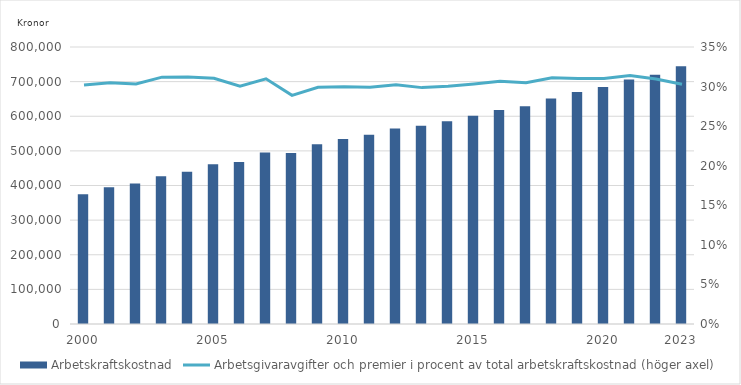
| Category | Arbetskraftskostnad |
|---|---|
| 2000.0 | 374821.811 |
| nan | 394929.41 |
| nan | 405636.358 |
| nan | 427073.221 |
| nan | 439980.788 |
| 2005.0 | 461141.969 |
| nan | 467924.926 |
| nan | 495044.887 |
| nan | 493653.782 |
| nan | 519279.334 |
| 2010.0 | 534587.595 |
| nan | 546799.999 |
| nan | 564698.307 |
| nan | 572591.528 |
| nan | 585351.15 |
| 2015.0 | 601377.773 |
| nan | 618225.75 |
| nan | 629143.79 |
| nan | 650948.555 |
| nan | 670259.514 |
| 2020.0 | 684817.213 |
| nan | 705953.668 |
| nan | 719751.138 |
| 2023.0 | 744509 |